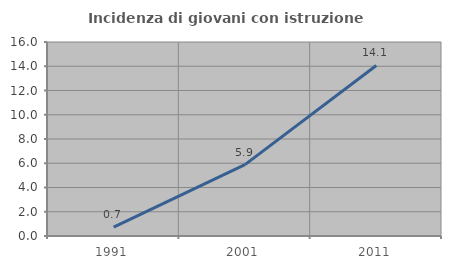
| Category | Incidenza di giovani con istruzione universitaria |
|---|---|
| 1991.0 | 0.725 |
| 2001.0 | 5.882 |
| 2011.0 | 14.062 |